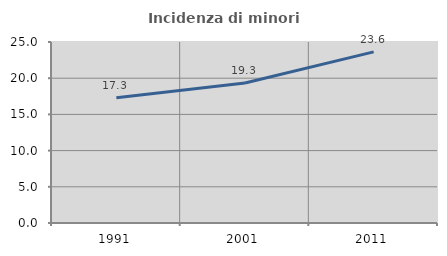
| Category | Incidenza di minori stranieri |
|---|---|
| 1991.0 | 17.308 |
| 2001.0 | 19.335 |
| 2011.0 | 23.639 |